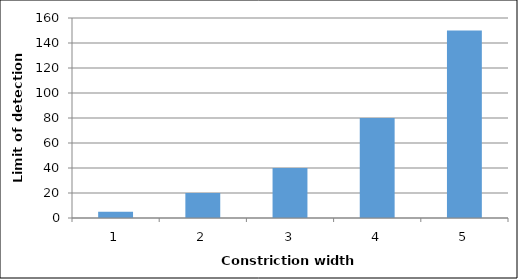
| Category | Colour intensity ratio |
|---|---|
| 1.0 | 5 |
| 2.0 | 20 |
| 3.0 | 40 |
| 4.0 | 80 |
| 5.0 | 150 |